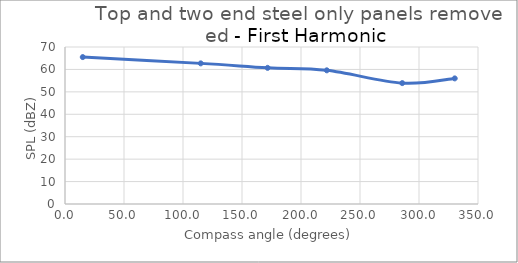
| Category | Series 0 |
|---|---|
| 15.06445125542554 | 65.5 |
| 115.00449447818254 | 62.7 |
| 171.7068171198818 | 60.7 |
| 221.8691292075067 | 59.6 |
| 285.7828166838848 | 53.9 |
| 330.28010595813004 | 56 |